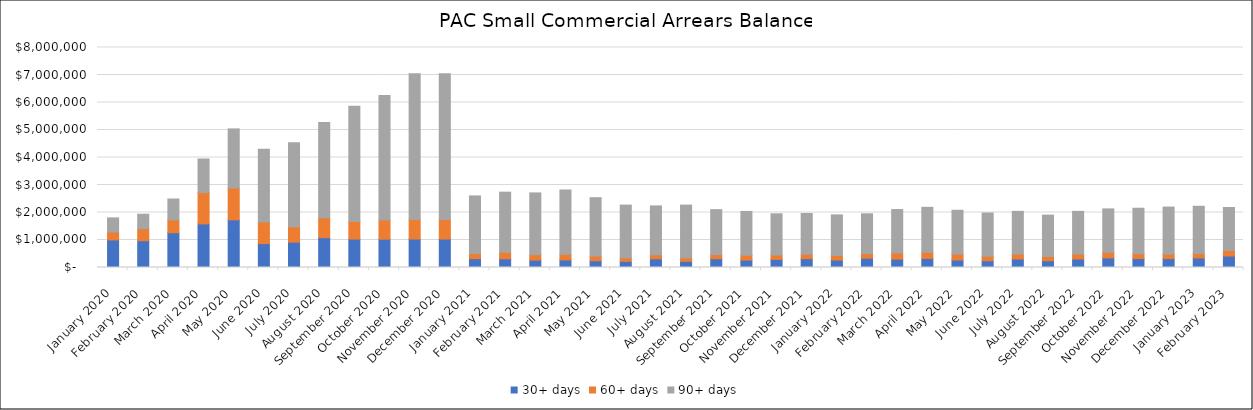
| Category | 30+ days | 60+ days | 90+ days |
|---|---|---|---|
| 2020-01-01 | 1002233.33 | 289661.26 | 511658.85 |
| 2020-02-01 | 973560.27 | 438879.26 | 524604.71 |
| 2020-03-01 | 1264318.24 | 464774.22 | 761183.24 |
| 2020-04-01 | 1585378.5 | 1137342.92 | 1222801.5 |
| 2020-05-01 | 1733799.79 | 1154441.35 | 2152323.35 |
| 2020-06-01 | 867709.78 | 788868.63 | 2643339.84 |
| 2020-07-01 | 920968.86 | 563675.19 | 3049909.39 |
| 2020-08-01 | 1085594.46 | 723724.53 | 3464298.69 |
| 2020-09-01 | 1033638.02 | 640657.71 | 4191757.38 |
| 2020-10-01 | 1028468.61 | 698806.7 | 4522940.63 |
| 2020-11-01 | 1035171.05 | 708091.23 | 5306334.28 |
| 2020-12-01 | 1035171.05 | 708091.23 | 5306334.28 |
| 2021-01-01 | 321618.89 | 183239.83 | 2097578.31 |
| 2021-02-01 | 315753 | 237198 | 2186742 |
| 2021-03-01 | 268438 | 198909 | 2244701 |
| 2021-04-01 | 275298 | 202823 | 2341709 |
| 2021-05-01 | 244877 | 170170 | 2123470 |
| 2021-06-01 | 222943 | 126839 | 1919232 |
| 2021-07-01 | 315102 | 146266 | 1777724 |
| 2021-08-01 | 222943 | 126839 | 1919232 |
| 2021-09-01 | 317704 | 150208 | 1636219 |
| 2021-10-01 | 269684 | 174299 | 1594773 |
| 2021-11-01 | 293703 | 161687 | 1496849 |
| 2021-12-01 | 320594 | 161617 | 1482599 |
| 2022-01-01 | 271427 | 169040 | 1472442 |
| 2022-02-01 | 338425 | 164041 | 1450067 |
| 2022-03-01 | 302785 | 223508 | 1581034 |
| 2022-04-01 | 328904 | 222459 | 1636894 |
| 2022-05-01 | 272272 | 214552 | 1594182 |
| 2022-06-01 | 244540 | 166498 | 1571739 |
| 2022-07-01 | 308293 | 179456 | 1553817 |
| 2022-08-01 | 245785 | 156264 | 1502548 |
| 2022-09-01 | 308293 | 179456 | 1553817 |
| 2022-10-01 | 346726 | 203759 | 1580321 |
| 2022-11-01 | 323826 | 177607 | 1653447 |
| 2022-12-01 | 323431 | 162474 | 1711948 |
| 2023-01-01 | 346448 | 162126 | 1718030 |
| 2023-02-01 | 417273 | 203186 | 1560822 |